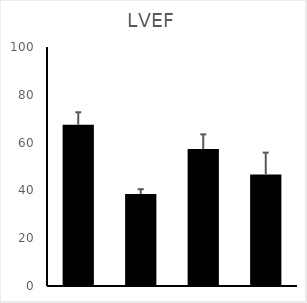
| Category | LVEF  |
|---|---|
| 0 | 67.5 |
| 1 | 38.486 |
| 2 | 57.367 |
| 3 | 46.683 |